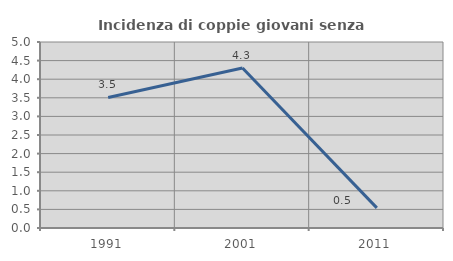
| Category | Incidenza di coppie giovani senza figli |
|---|---|
| 1991.0 | 3.509 |
| 2001.0 | 4.301 |
| 2011.0 | 0.541 |